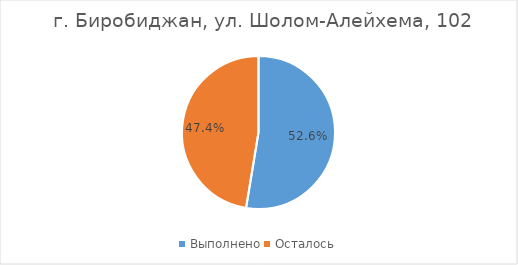
| Category |  г. Биробиджан, ул. Шолом-Алейхема, 102 |
|---|---|
| Выполнено | 0.526 |
| Осталось | 0.474 |